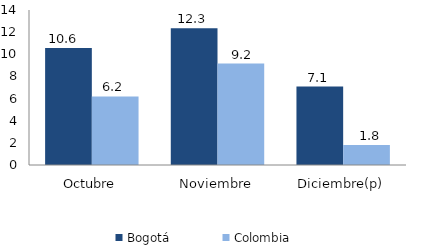
| Category | Bogotá | Colombia |
|---|---|---|
| Octubre | 10.557 | 6.197 |
| Noviembre | 12.342 | 9.168 |
| Diciembre(p) | 7.086 | 1.797 |